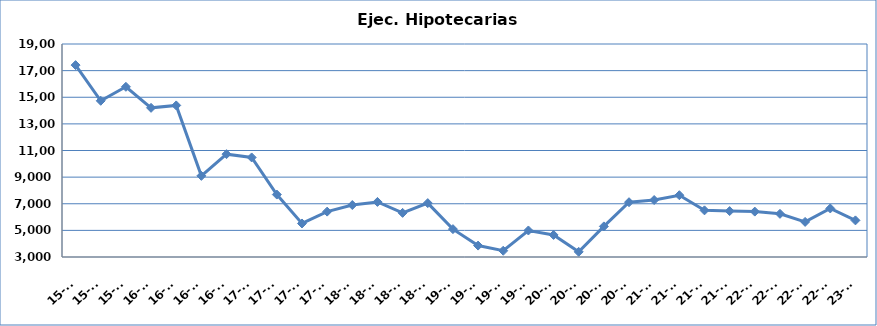
| Category | Ej. Hipotecarias |
|---|---|
| 15-T2 | 17414 |
| 15-T3 | 14735 |
| 15-T4 | 15785 |
| 16-T1 | 14205 |
| 16-T2 | 14385 |
| 16-T3 | 9094 |
| 16-T4 | 10726 |
| 17-T1 | 10478 |
| 17-T2 | 7689 |
| 17-T3 | 5518 |
| 17-T4 | 6409 |
| 18-T1 | 6903 |
| 18-T2 | 7137 |
| 18-T3 | 6315 |
| 18-T4 | 7049 |
| 19-T1 | 5092 |
| 19-T2 | 3857 |
| 19-T3 | 3470 |
| 19-T4 | 4992 |
| 20-T1 | 4658 |
| 20-T2 | 3387 |
| 20-T3 | 5299 |
| 20-T4 | 7116 |
| 21-T1 | 7280 |
| 21-T2 | 7641 |
| 21-T3 | 6504 |
| 21-T4 | 6449 |
| 22-T1 | 6410 |
| 22-T2 | 6242 |
| 22-T3 | 5637 |
| 22-T4 | 6646 |
| 23-T1 | 5751 |